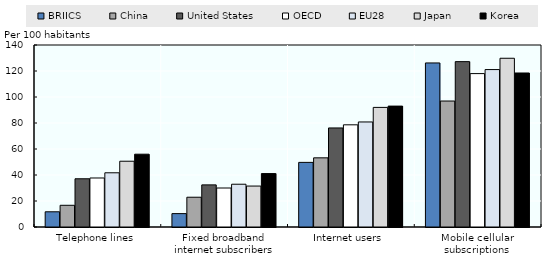
| Category | BRIICS | China | United States | OECD | EU28 | Japan | Korea |
|---|---|---|---|---|---|---|---|
| Telephone lines | 11.7 | 16.7 | 37.1 | 37.7 | 41.7 | 50.6 | 56 |
| Fixed broadband internet subscribers | 10.3 | 22.9 | 32.4 | 30 | 32.9 | 31.5 | 41.1 |
| Internet users | 49.7 | 53.2 | 76.2 | 78.6 | 80.8 | 92 | 93 |
| Mobile cellular subscriptions | 126.2 | 96.9 | 127.2 | 118 | 121.1 | 129.8 | 118.462 |